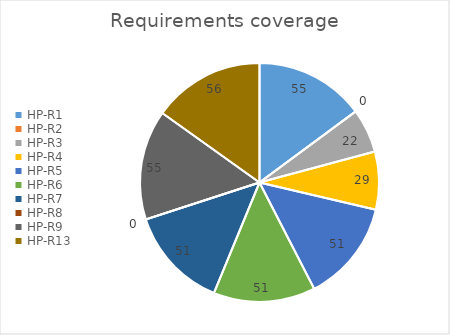
| Category | Series 0 |
|---|---|
| HP-R1 | 55 |
| HP-R2 | 0 |
| HP-R3 | 22 |
| HP-R4 | 29 |
| HP-R5 | 51 |
| HP-R6 | 51 |
| HP-R7 | 51 |
| HP-R8 | 0 |
| HP-R9 | 55 |
| HP-R13 | 56 |